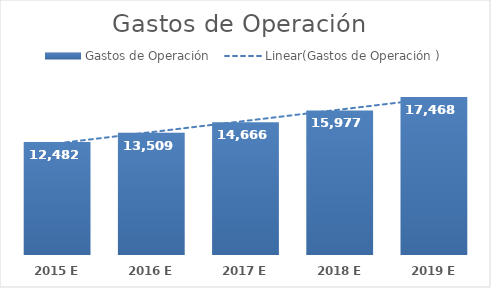
| Category | Gastos de Operación  |
|---|---|
| 2015 E | 12481.962 |
| 2016 E | 13508.796 |
| 2017 E | 14666.303 |
| 2018 E | 15977.097 |
| 2019 E | 17468.387 |